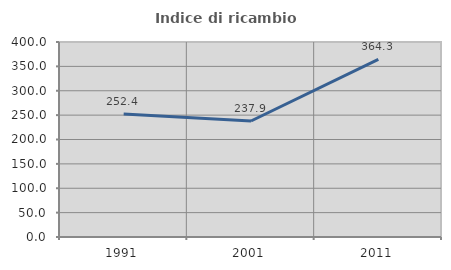
| Category | Indice di ricambio occupazionale  |
|---|---|
| 1991.0 | 252.381 |
| 2001.0 | 237.931 |
| 2011.0 | 364.286 |